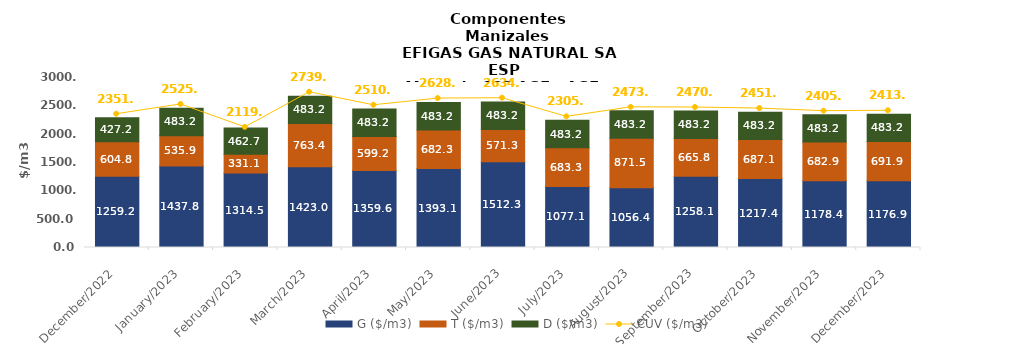
| Category | G ($/m3) | T ($/m3) | D ($/m3) |
|---|---|---|---|
| 2022-12-01 | 1259.19 | 604.8 | 427.16 |
| 2023-01-01 | 1437.76 | 535.94 | 483.2 |
| 2023-02-01 | 1314.49 | 331.09 | 462.69 |
| 2023-03-01 | 1422.95 | 763.36 | 483.205 |
| 2023-04-01 | 1359.57 | 599.24 | 483.2 |
| 2023-05-01 | 1393.1 | 682.25 | 483.2 |
| 2023-06-01 | 1512.34 | 571.34 | 483.2 |
| 2023-07-01 | 1077.14 | 683.33 | 483.2 |
| 2023-08-01 | 1056.36 | 871.51 | 483.2 |
| 2023-09-01 | 1258.12 | 665.75 | 483.2 |
| 2023-10-01 | 1217.367 | 687.084 | 483.205 |
| 2023-11-01 | 1178.421 | 682.88 | 483.205 |
| 2023-12-01 | 1176.905 | 691.935 | 483.205 |